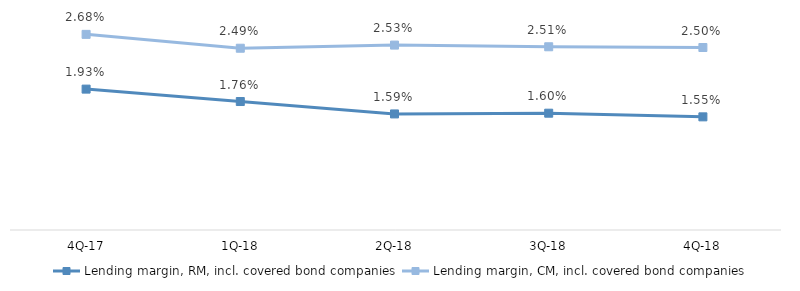
| Category | Lending margin, RM, incl. covered bond companies | Lending margin, CM, incl. covered bond companies |
|---|---|---|
| 4Q-18 | 0.016 | 0.025 |
| 3Q-18 | 0.016 | 0.025 |
| 2Q-18 | 0.016 | 0.025 |
| 1Q-18 | 0.018 | 0.025 |
| 4Q-17 | 0.019 | 0.027 |